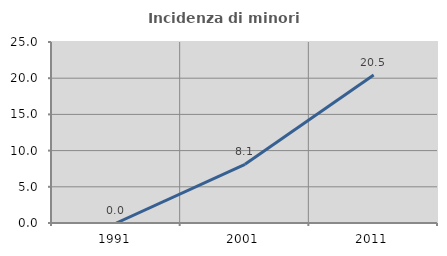
| Category | Incidenza di minori stranieri |
|---|---|
| 1991.0 | 0 |
| 2001.0 | 8.108 |
| 2011.0 | 20.455 |